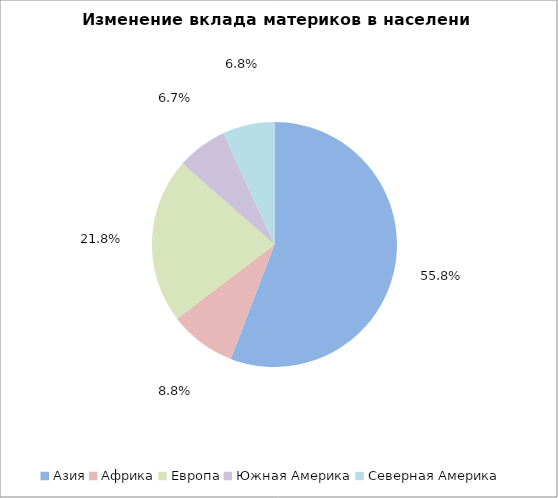
| Category | 2000 г. |
|---|---|
| Азия | 3679737000 |
| Африка | 795671000 |
| Европа | 727986000 |
| Южная Америка | 520229000 |
| Северная Америка | 315915000 |